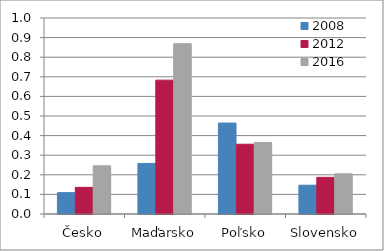
| Category | 2008 | 2012 | 2016 |
|---|---|---|---|
| Česko | 0.109 | 0.136 | 0.246 |
| Maďarsko | 0.258 | 0.683 | 0.869 |
| Poľsko | 0.464 | 0.356 | 0.365 |
| Slovensko | 0.147 | 0.187 | 0.205 |